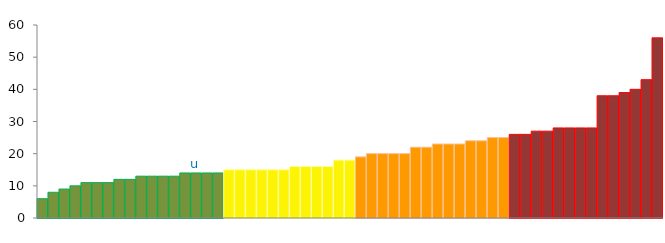
| Category | Top Quartile | 2nd Quartile | 3rd Quartile | Bottom Quartile | Series 4 |
|---|---|---|---|---|---|
|  | 6 | 0 | 0 | 0 | 6 |
|  | 8 | 0 | 0 | 0 | 8 |
|  | 9 | 0 | 0 | 0 | 9 |
|  | 10 | 0 | 0 | 0 | 10 |
|  | 11 | 0 | 0 | 0 | 11 |
|  | 11 | 0 | 0 | 0 | 11 |
|  | 11 | 0 | 0 | 0 | 11 |
|  | 12 | 0 | 0 | 0 | 12 |
|  | 12 | 0 | 0 | 0 | 12 |
|  | 13 | 0 | 0 | 0 | 13 |
|  | 13 | 0 | 0 | 0 | 13 |
|  | 13 | 0 | 0 | 0 | 13 |
|  | 13 | 0 | 0 | 0 | 13 |
|  | 14 | 0 | 0 | 0 | 14 |
| u | 14 | 0 | 0 | 0 | 14 |